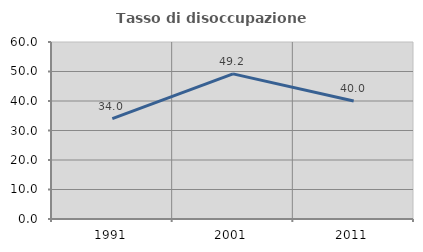
| Category | Tasso di disoccupazione giovanile  |
|---|---|
| 1991.0 | 34.025 |
| 2001.0 | 49.194 |
| 2011.0 | 40 |